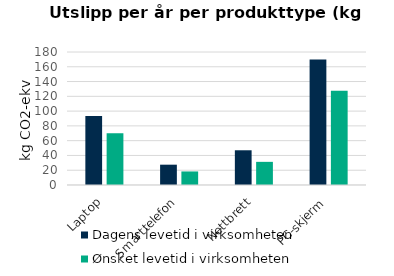
| Category | Dagens levetid i virksomheten | Ønsket levetid i virksomheten |
|---|---|---|
| Laptop | 93.333 | 70 |
| Smarttelefon | 27.5 | 18.333 |
| Nettbrett | 47 | 31.333 |
| PC-skjerm | 170 | 127.5 |